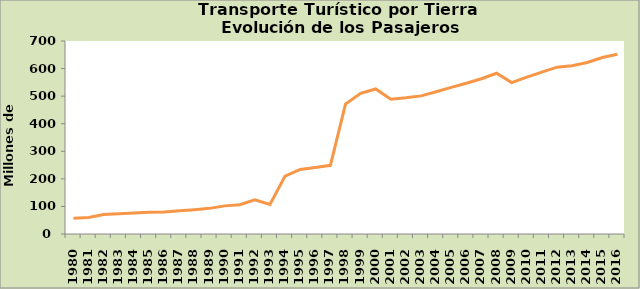
| Category | Series 0 |
|---|---|
| 1980.0 | 57 |
| 1981.0 | 60 |
| 1982.0 | 71 |
| 1983.0 | 73 |
| 1984.0 | 76 |
| 1985.0 | 79 |
| 1986.0 | 80 |
| 1987.0 | 84 |
| 1988.0 | 88 |
| 1989.0 | 93 |
| 1990.0 | 102 |
| 1991.0 | 106 |
| 1992.0 | 124 |
| 1993.0 | 107 |
| 1994.0 | 210 |
| 1995.0 | 234 |
| 1996.0 | 241 |
| 1997.0 | 249 |
| 1998.0 | 471 |
| 1999.0 | 510 |
| 2000.0 | 526 |
| 2001.0 | 489 |
| 2002.0 | 494 |
| 2003.0 | 501 |
| 2004.0 | 516 |
| 2005.0 | 532 |
| 2006.0 | 547 |
| 2007.0 | 563 |
| 2008.0 | 583 |
| 2009.0 | 549 |
| 2010.0 | 569 |
| 2011.0 | 587 |
| 2012.0 | 605 |
| 2013.0 | 610 |
| 2014.0 | 622.205 |
| 2015.0 | 640 |
| 2016.0 | 652.14 |